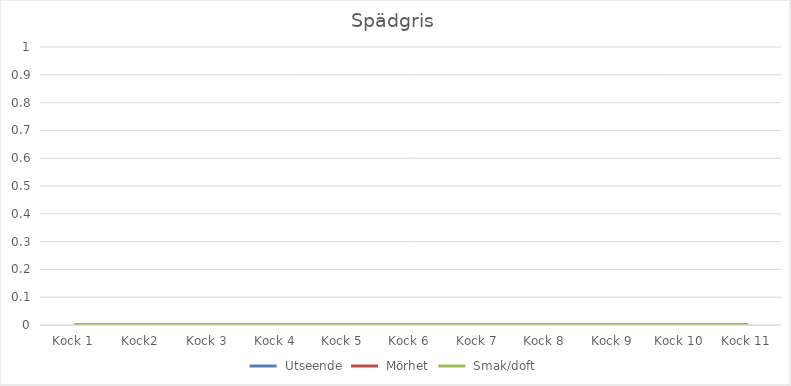
| Category | Utseende | Mörhet | Smak/doft |
|---|---|---|---|
| Kock 1 | 0 | 0 | 0 |
| Kock2 | 0 | 0 | 0 |
| Kock 3 | 0 | 0 | 0 |
| Kock 4 | 0 | 0 | 0 |
| Kock 5 | 0 | 0 | 0 |
| Kock 6 | 0 | 0 | 0 |
| Kock 7 | 0 | 0 | 0 |
| Kock 8 | 0 | 0 | 0 |
| Kock 9 | 0 | 0 | 0 |
| Kock 10 | 0 | 0 | 0 |
| Kock 11 | 0 | 0 | 0 |